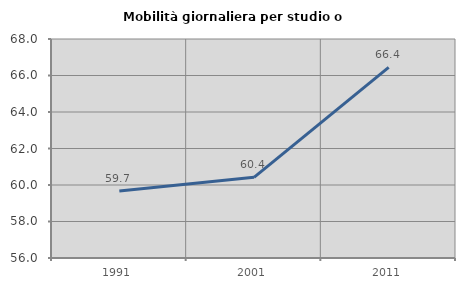
| Category | Mobilità giornaliera per studio o lavoro |
|---|---|
| 1991.0 | 59.671 |
| 2001.0 | 60.421 |
| 2011.0 | 66.444 |